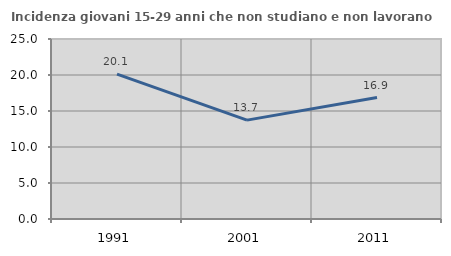
| Category | Incidenza giovani 15-29 anni che non studiano e non lavorano  |
|---|---|
| 1991.0 | 20.118 |
| 2001.0 | 13.73 |
| 2011.0 | 16.867 |